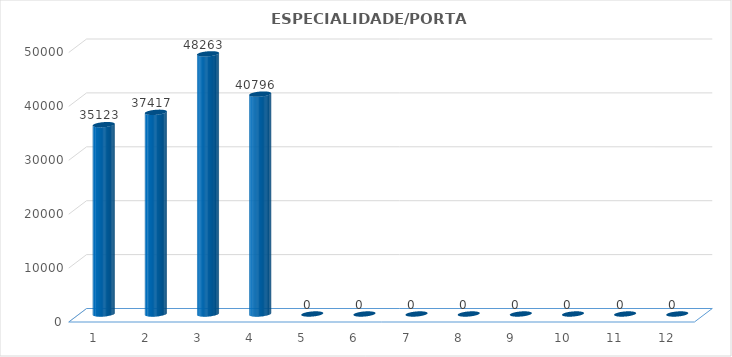
| Category | Series 0 |
|---|---|
| 0 | 35123 |
| 1 | 37417 |
| 2 | 48263 |
| 3 | 40796 |
| 4 | 0 |
| 5 | 0 |
| 6 | 0 |
| 7 | 0 |
| 8 | 0 |
| 9 | 0 |
| 10 | 0 |
| 11 | 0 |